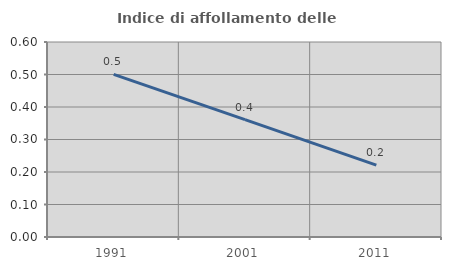
| Category | Indice di affollamento delle abitazioni  |
|---|---|
| 1991.0 | 0.501 |
| 2001.0 | 0.361 |
| 2011.0 | 0.221 |